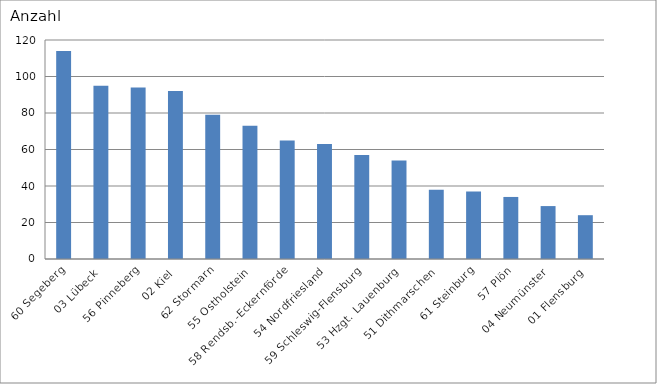
| Category | 60 Segeberg 03 Lübeck 56 Pinneberg 02 Kiel 62 Stormarn 55 Ostholstein 58 Rendsb.-Eckernförde 54 Nordfriesland 59 Schleswig-Flensburg 53 Hzgt. Lauenburg 51 Dithmarschen 61 Steinburg 57 Plön 04 Neumünster 01 Flensburg |
|---|---|
| 60 Segeberg | 114 |
| 03 Lübeck | 95 |
| 56 Pinneberg | 94 |
| 02 Kiel | 92 |
| 62 Stormarn | 79 |
| 55 Ostholstein | 73 |
| 58 Rendsb.-Eckernförde | 65 |
| 54 Nordfriesland | 63 |
| 59 Schleswig-Flensburg | 57 |
| 53 Hzgt. Lauenburg | 54 |
| 51 Dithmarschen | 38 |
| 61 Steinburg | 37 |
| 57 Plön | 34 |
| 04 Neumünster | 29 |
| 01 Flensburg | 24 |